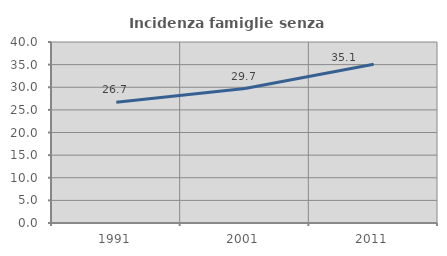
| Category | Incidenza famiglie senza nuclei |
|---|---|
| 1991.0 | 26.667 |
| 2001.0 | 29.714 |
| 2011.0 | 35.088 |